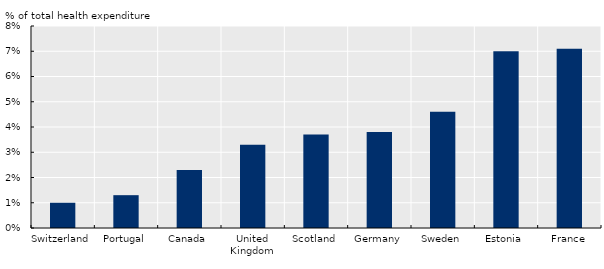
| Category | Series 0 |
|---|---|
| Switzerland | 0.01 |
| Portugal | 0.013 |
| Canada | 0.023 |
| United Kingdom | 0.033 |
| Scotland | 0.037 |
| Germany | 0.038 |
| Sweden | 0.046 |
| Estonia | 0.07 |
| France | 0.071 |